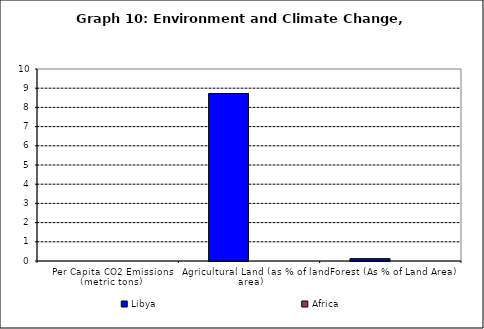
| Category | Libya | Africa |
|---|---|---|
| Per Capita CO2 Emissions (metric tons) | 0 | 0 |
| Agricultural Land (as % of land area) | 8.724 | 0 |
| Forest (As % of Land Area) | 0.123 | 0 |